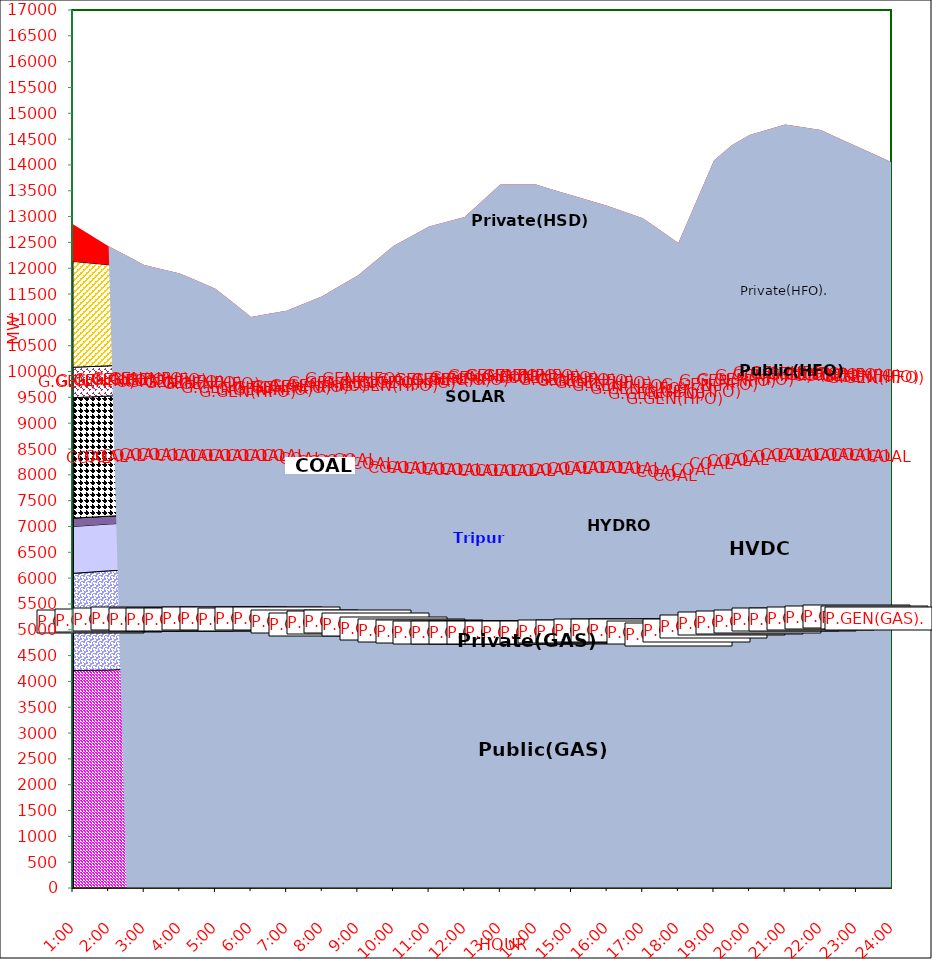
| Category | GAS | P.GEN(GAS). |  HVDC | TRIPURA | HYDRO | COAL | SOLAR | G.GEN(HFO) | P.GEN(HFO). | G.GEN(HSD) | P.GEN(HSD) | SHORTAGE | Total Energy Gen 301.083 MKWHr 
Energy Not Served   9.919 MKWHr 
Energy Requirement     311.002 MKWHr  |
|---|---|---|---|---|---|---|---|---|---|---|---|---|---|
| 1:00 | 4209 | 1883 | 908 | 162 | 0 | 2331 | 0 | 590 | 2049 | 0 | 0 | 721.025 |  |
| 1:30 | 4214 | 1902.5 | 907 | 157 | 0 | 2328.5 | 0 | 587.5 | 2003.5 | 0 | 0 | 540.53 |  |
| 2:00 | 4219 | 1922 | 906 | 152 | 0 | 2326 | 0 | 585 | 1958 | 0 | 0 | 360.035 |  |
| 2:30 | 4233 | 1924.5 | 907.5 | 153 | 0 | 2327.5 | 0 | 587.5 | 1807.5 | 0 | 0 | 305.122 |  |
| 3:00 | 4247 | 1927 | 909 | 154 | 0 | 2329 | 0 | 590 | 1657 | 0 | 0 | 250.21 |  |
| 3:30 | 4250.5 | 1908.5 | 909.5 | 151 | 0 | 2330 | 0 | 578 | 1613.5 | 0 | 0 | 239.227 |  |
| 4:00 | 4254 | 1890 | 910 | 148 | 0 | 2331 | 0 | 566 | 1570 | 0 | 0 | 228.245 |  |
| 4:30 | 4261 | 1891.5 | 909.5 | 146 | 0 | 2329 | 0 | 504 | 1489.5 | 0 | 0 | 220.605 |  |
| 5:00 | 4268 | 1893 | 909 | 144 | 0 | 2327 | 0 | 442 | 1409 | 0 | 0 | 212.965 |  |
| 5:30 | 4251.5 | 1914 | 909 | 136 | 0 | 2327 | 8.5 | 283.5 | 1279 | 0 | 0 | 222.993 |  |
| 6:00 | 4235 | 1935 | 909 | 128 | 0 | 2327 | 17 | 125 | 1149 | 0 | 0 | 233.02 |  |
| 6:30 | 4242 | 1938 | 909.5 | 122 | 0 | 2327 | 56.5 | 120.5 | 1149 | 0 | 0 | 254.03 |  |
| 7:00 | 4249 | 1941 | 910 | 116 | 0 | 2327 | 96 | 116 | 1149 | 0 | 0 | 275.04 |  |
| 7:30 | 4197.5 | 1920 | 910 | 125 | 0 | 2331.5 | 150.5 | 150.5 | 1260.5 | 0 | 0 | 272.175 |  |
| 8:00 | 4146 | 1899 | 910 | 134 | 0 | 2336 | 205 | 185 | 1372 | 0 | 0 | 269.31 |  |
| 8:30 | 4186.5 | 1889.5 | 910 | 136 | 0 | 2309 | 251 | 215 | 1483.5 | 0 | 0 | 278.382 |  |
| 9:00 | 4227 | 1880 | 910 | 138 | 0 | 2282 | 297 | 245 | 1595 | 0 | 0 | 287.455 |  |
| 9:30 | 4159 | 1869 | 908.5 | 142 | 12.5 | 2263 | 300.5 | 277.5 | 1778.5 | 0 | 171 | 263.58 |  |
| 10:00 | 4091 | 1858 | 907 | 146 | 25 | 2244 | 304 | 310 | 1962 | 0 | 342 | 239.705 |  |
| 10:30 | 4066 | 1856 | 907 | 148 | 25 | 2266 | 357 | 327.5 | 2127 | 0 | 397 | 142.772 |  |
| 11:00 | 4041 | 1854 | 907 | 150 | 25 | 2288 | 410 | 345 | 2292 | 0 | 452 | 45.84 |  |
| 11:30 | 4030.5 | 1850.5 | 907.5 | 153 | 25 | 2284 | 415 | 358.5 | 2302 | 0 | 454 | 121.92 |  |
| 12:00 | 4020 | 1847 | 908 | 156 | 25 | 2280 | 420 | 372 | 2312 | 0 | 456 | 198 |  |
| 12:30 | 4024.5 | 1834 | 908 | 157 | 25 | 2288.5 | 414 | 457.5 | 2408.5 | 0 | 430 | 360.192 |  |
| 13:00 | 4029 | 1821 | 908 | 158 | 25 | 2297 | 408 | 543 | 2505 | 0 | 404 | 522.385 |  |
| 13:30 | 4029 | 1821 | 908 | 158 | 25 | 2297 | 408 | 543 | 2505 | 0 | 404 | 522.385 |  |
| 14:00 | 4029 | 1821 | 908 | 158 | 25 | 2297 | 408 | 543 | 2505 | 0 | 404 | 522.385 |  |
| 14:30 | 4041.5 | 1825.5 | 908 | 163 | 25 | 2291 | 340.5 | 580.5 | 2292 | 0 | 372 | 676.617 |  |
| 15:00 | 4054 | 1830 | 908 | 168 | 25 | 2285 | 273 | 618 | 2079 | 0 | 340 | 830.85 |  |
| 15:30 | 4059.5 | 1832 | 908 | 162 | 25 | 2294.5 | 232 | 620 | 2141.5 | 0 | 170 | 864.752 |  |
| 16:00 | 4065 | 1834 | 908 | 156 | 25 | 2304 | 191 | 622 | 2204 | 0 | 0 | 898.655 |  |
| 16:30 | 4072.5 | 1824 | 908 | 153 | 25 | 2302.5 | 139.5 | 624 | 2260 | 0 | 0 | 779.757 |  |
| 17:00 | 4080 | 1814 | 908 | 150 | 25 | 2301 | 88 | 626 | 2316 | 0 | 0 | 660.86 |  |
| 17:30 | 4052.5 | 1788.5 | 908.5 | 149 | 25 | 2272 | 51.5 | 655 | 2365 | 0 | 0 | 461.265 |  |
| 18:00 | 4025 | 1763 | 909 | 148 | 25 | 2243 | 15 | 684 | 2414 | 0 | 0 | 261.67 |  |
| 18:30 | 4075.5 | 1817.5 | 908.5 | 147 | 25 | 2262 | 7.5 | 735 | 2824.5 | 0 | 224.5 | 260.715 |  |
| 19:00 | 4126 | 1872 | 908 | 146 | 25 | 2281 | 0 | 786 | 3235 | 0 | 449 | 259.76 |  |
| 19:30 | 4169 | 1898 | 864 | 154 | 25 | 2327 | 0 | 783 | 3433 | 0 | 361 | 369.585 |  |
| 20:00 | 4180 | 1916 | 865 | 152 | 25 | 2309 | 0 | 808 | 3517 | 0 | 326 | 479.41 |  |
| 20:30 | 4207 | 1916 | 889 | 150 | 25 | 2319 | 0 | 818 | 3501 | 0 | 389.5 | 464.607 |  |
| 21:00 | 4234 | 1916 | 913 | 148 | 25 | 2329 | 0 | 828 | 3485 | 0 | 453 | 449.805 |  |
| 21:30 | 4238.5 | 1931.5 | 879.5 | 149 | 25 | 2328 | 0 | 816 | 3427.5 | 0 | 453.5 | 479.887 |  |
| 22:00 | 4243 | 1947 | 846 | 150 | 25 | 2327 | 0 | 804 | 3370 | 0 | 454 | 509.97 |  |
| 22:30 | 4263 | 1948 | 845 | 159 | 12.5 | 2319 | 0 | 778 | 3079 | 0 | 452.5 | 662.77 |  |
| 23:00 | 4283 | 1949 | 844 | 168 | 0 | 2311 | 0 | 752 | 2788 | 0 | 451 | 815.57 |  |
| 23:30 | 4260 | 1950 | 845 | 167 | 0 | 2311 | 0 | 748.5 | 2533.5 | 0 | 449.5 | 941.152 |  |
| 24:00 | 4237 | 1951 | 846 | 166 | 0 | 2311 | 0 | 745 | 2279 | 0 | 448 | 1066.735 |  |